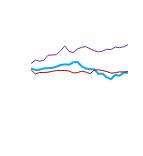
| Category | Online | Store | Phone |
|---|---|---|---|
| 0 | 6468 | 6008 | 5865 |
| 1 | 6784 | 5848 | 5476 |
| 2 | 6685 | 5874 | 5617 |
| 3 | 6748 | 6000 | 5610 |
| 4 | 7240 | 6023 | 5646 |
| 5 | 7268 | 6043 | 5717 |
| 6 | 7293 | 6166 | 5800 |
| 7 | 7653 | 6319 | 5804 |
| 8 | 8128 | 6381 | 5803 |
| 9 | 7599 | 6345 | 5758 |
| 10 | 7493 | 6566 | 5573 |
| 11 | 7823 | 6611 | 5602 |
| 12 | 7989 | 6198 | 5730 |
| 13 | 8055 | 5991 | 5655 |
| 14 | 7855 | 5924 | 5493 |
| 15 | 7671 | 5920 | 5843 |
| 16 | 7563 | 5487 | 5861 |
| 17 | 7635 | 5499 | 5801 |
| 18 | 7810 | 5148 | 5700 |
| 19 | 7787 | 4994 | 5555 |
| 20 | 8009 | 5389 | 5586 |
| 21 | 7958 | 5316 | 5668 |
| 22 | 8042 | 5587 | 5664 |
| 23 | 8238 | 5595 | 5699 |